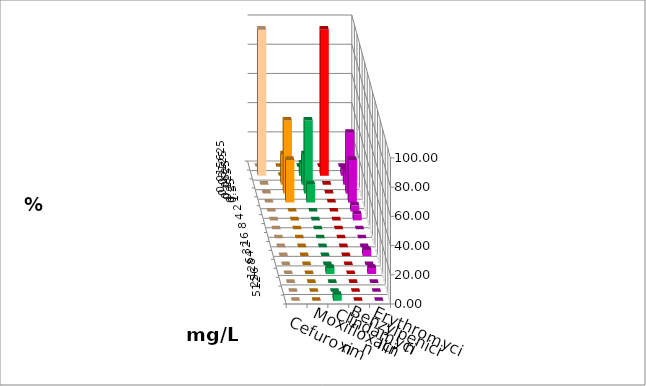
| Category | Cefuroxim | Moxifloxacin | Clindamycin | Benzylpenicillin | Erythromycin |
|---|---|---|---|---|---|
| 0.015625 | 0 | 0 | 0 | 0 | 0 |
| 0.03125 | 100 | 0 | 8.333 | 100 | 4.167 |
| 0.0625 | 0 | 20.833 | 20.833 | 0 | 8.333 |
| 0.125 | 0 | 50 | 50 | 0 | 41.667 |
| 0.25 | 0 | 29.167 | 12.5 | 0 | 29.167 |
| 0.5 | 0 | 0 | 0 | 0 | 4.167 |
| 1.0 | 0 | 0 | 0 | 0 | 4.167 |
| 2.0 | 0 | 0 | 0 | 0 | 0 |
| 4.0 | 0 | 0 | 0 | 0 | 0 |
| 8.0 | 0 | 0 | 0 | 0 | 0 |
| 16.0 | 0 | 0 | 0 | 0 | 4.167 |
| 32.0 | 0 | 0 | 0 | 0 | 0 |
| 64.0 | 0 | 0 | 4.167 | 0 | 4.167 |
| 128.0 | 0 | 0 | 0 | 0 | 0 |
| 256.0 | 0 | 0 | 0 | 0 | 0 |
| 512.0 | 0 | 0 | 4.167 | 0 | 0 |